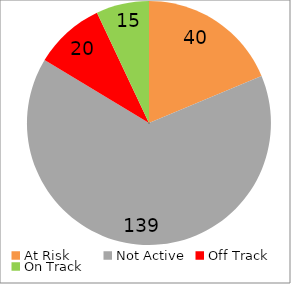
| Category | Series 0 |
|---|---|
| At Risk | 40 |
| Not Active | 139 |
| Off Track | 20 |
| On Track | 15 |